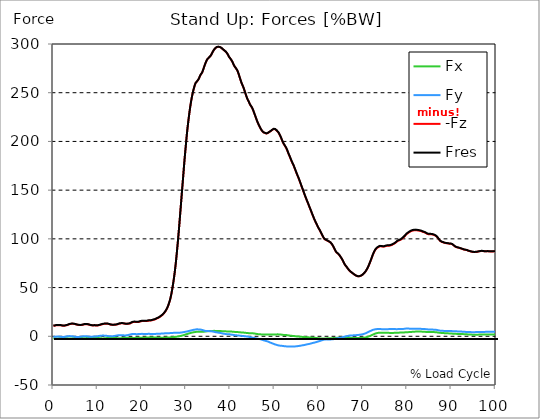
| Category |  Fx |  Fy |  -Fz |  Fres |
|---|---|---|---|---|
| 0.0 | -2.012 | -0.678 | 10.796 | 11.042 |
| 0.167348456675344 | -2.105 | -0.564 | 10.841 | 11.093 |
| 0.334696913350688 | -2.178 | -0.451 | 10.933 | 11.192 |
| 0.5020453700260321 | -2.222 | -0.402 | 11.114 | 11.377 |
| 0.669393826701376 | -2.264 | -0.354 | 11.294 | 11.561 |
| 0.83674228337672 | -2.264 | -0.311 | 11.34 | 11.601 |
| 1.0040907400520642 | -2.215 | -0.286 | 11.389 | 11.636 |
| 1.1621420602454444 | -2.163 | -0.285 | 11.427 | 11.659 |
| 1.3294905169207885 | -2.096 | -0.346 | 11.431 | 11.65 |
| 1.4968389735961325 | -1.988 | -0.458 | 11.356 | 11.561 |
| 1.6641874302714765 | -1.904 | -0.535 | 11.271 | 11.467 |
| 1.8315358869468206 | -1.839 | -0.616 | 11.125 | 11.324 |
| 1.9988843436221646 | -1.787 | -0.683 | 10.969 | 11.173 |
| 2.1662328002975086 | -1.768 | -0.686 | 10.851 | 11.054 |
| 2.333581256972853 | -1.779 | -0.636 | 10.795 | 10.994 |
| 2.5009297136481967 | -1.816 | -0.544 | 10.87 | 11.068 |
| 2.6682781703235405 | -1.85 | -0.436 | 11.017 | 11.212 |
| 2.8356266269988843 | -1.914 | -0.3 | 11.167 | 11.372 |
| 3.002975083674229 | -1.995 | -0.172 | 11.331 | 11.547 |
| 3.1703235403495724 | -2.083 | -0.059 | 11.519 | 11.742 |
| 3.337671997024917 | -2.187 | 0.063 | 11.827 | 12.063 |
| 3.4957233172182973 | -2.279 | 0.157 | 12.186 | 12.433 |
| 3.663071773893641 | -2.312 | 0.202 | 12.444 | 12.697 |
| 3.8304202305689854 | -2.305 | 0.189 | 12.641 | 12.89 |
| 3.997768687244329 | -2.253 | 0.122 | 12.739 | 12.979 |
| 4.165117143919673 | -2.19 | 0.047 | 12.81 | 13.038 |
| 4.332465600595017 | -2.113 | -0.046 | 12.842 | 13.058 |
| 4.499814057270361 | -2.01 | -0.167 | 12.809 | 13.014 |
| 4.667162513945706 | -1.898 | -0.305 | 12.736 | 12.93 |
| 4.834510970621049 | -1.778 | -0.455 | 12.582 | 12.768 |
| 5.001859427296393 | -1.671 | -0.591 | 12.383 | 12.566 |
| 5.169207883971737 | -1.606 | -0.669 | 12.154 | 12.337 |
| 5.336556340647081 | -1.542 | -0.727 | 11.914 | 12.097 |
| 5.503904797322425 | -1.518 | -0.734 | 11.768 | 11.95 |
| 5.671253253997769 | -1.523 | -0.707 | 11.649 | 11.83 |
| 5.82930457419115 | -1.561 | -0.637 | 11.558 | 11.739 |
| 5.996653030866494 | -1.611 | -0.548 | 11.492 | 11.673 |
| 6.164001487541838 | -1.677 | -0.434 | 11.493 | 11.678 |
| 6.331349944217181 | -1.74 | -0.326 | 11.55 | 11.743 |
| 6.498698400892526 | -1.827 | -0.19 | 11.669 | 11.873 |
| 6.66604685756787 | -1.909 | -0.076 | 11.864 | 12.081 |
| 6.833395314243213 | -1.954 | 0.013 | 12.068 | 12.303 |
| 7.000743770918558 | -1.993 | 0.096 | 12.266 | 12.517 |
| 7.168092227593902 | -1.99 | 0.12 | 12.366 | 12.615 |
| 7.335440684269246 | -1.933 | 0.082 | 12.416 | 12.654 |
| 7.50278914094459 | -1.823 | -0.015 | 12.43 | 12.652 |
| 7.6701375976199335 | -1.728 | -0.123 | 12.361 | 12.572 |
| 7.837486054295278 | -1.636 | -0.255 | 12.22 | 12.424 |
| 7.995537374488658 | -1.552 | -0.355 | 12.041 | 12.235 |
| 8.162885831164003 | -1.454 | -0.46 | 11.777 | 11.969 |
| 8.330234287839346 | -1.384 | -0.52 | 11.558 | 11.751 |
| 8.49758274451469 | -1.367 | -0.511 | 11.415 | 11.609 |
| 8.664931201190035 | -1.383 | -0.452 | 11.251 | 11.446 |
| 8.832279657865378 | -1.406 | -0.383 | 11.168 | 11.369 |
| 8.999628114540721 | -1.449 | -0.28 | 11.138 | 11.346 |
| 9.166976571216066 | -1.514 | -0.171 | 11.189 | 11.398 |
| 9.334325027891412 | -1.556 | -0.105 | 11.272 | 11.482 |
| 9.501673484566755 | -1.529 | -0.141 | 11.166 | 11.372 |
| 9.669021941242098 | -1.542 | -0.151 | 11.022 | 11.235 |
| 9.836370397917442 | -1.608 | -0.044 | 11.022 | 11.246 |
| 10.003718854592787 | -1.671 | 0.075 | 11.108 | 11.34 |
| 10.17106731126813 | -1.748 | 0.2 | 11.244 | 11.484 |
| 10.329118631461512 | -1.841 | 0.333 | 11.41 | 11.661 |
| 10.496467088136853 | -1.95 | 0.458 | 11.616 | 11.88 |
| 10.663815544812199 | -2.064 | 0.567 | 11.846 | 12.127 |
| 10.831164001487544 | -2.114 | 0.621 | 12.074 | 12.361 |
| 10.998512458162887 | -2.158 | 0.675 | 12.288 | 12.579 |
| 11.16586091483823 | -2.179 | 0.711 | 12.485 | 12.777 |
| 11.333209371513574 | -2.159 | 0.706 | 12.648 | 12.934 |
| 11.50055782818892 | -2.119 | 0.683 | 12.772 | 13.049 |
| 11.667906284864264 | -2.035 | 0.616 | 12.829 | 13.09 |
| 11.835254741539607 | -1.953 | 0.556 | 12.872 | 13.118 |
| 12.00260319821495 | -1.865 | 0.478 | 12.898 | 13.13 |
| 12.169951654890292 | -1.769 | 0.378 | 12.879 | 13.096 |
| 12.337300111565641 | -1.659 | 0.246 | 12.808 | 13.012 |
| 12.504648568240984 | -1.555 | 0.107 | 12.665 | 12.861 |
| 12.662699888434362 | -1.488 | 0.023 | 12.421 | 12.619 |
| 12.830048345109708 | -1.446 | -0.006 | 12.139 | 12.334 |
| 12.997396801785053 | -1.418 | -0.019 | 11.902 | 12.096 |
| 13.164745258460396 | -1.415 | 0.007 | 11.779 | 11.969 |
| 13.33209371513574 | -1.426 | 0.058 | 11.725 | 11.911 |
| 13.499442171811083 | -1.467 | 0.142 | 11.719 | 11.906 |
| 13.666790628486426 | -1.524 | 0.237 | 11.743 | 11.934 |
| 13.834139085161771 | -1.58 | 0.358 | 11.787 | 11.986 |
| 14.001487541837117 | -1.644 | 0.48 | 11.81 | 12.021 |
| 14.16883599851246 | -1.725 | 0.619 | 11.913 | 12.138 |
| 14.336184455187803 | -1.82 | 0.772 | 12.08 | 12.322 |
| 14.503532911863147 | -1.918 | 0.927 | 12.279 | 12.541 |
| 14.670881368538492 | -2.01 | 1.05 | 12.545 | 12.826 |
| 14.828932688731873 | -2.063 | 1.131 | 12.811 | 13.099 |
| 14.996281145407215 | -2.065 | 1.168 | 13.039 | 13.322 |
| 15.163629602082558 | -2.029 | 1.196 | 13.191 | 13.464 |
| 15.330978058757903 | -1.956 | 1.186 | 13.282 | 13.538 |
| 15.498326515433247 | -1.863 | 1.139 | 13.322 | 13.557 |
| 15.665674972108594 | -1.747 | 1.058 | 13.303 | 13.518 |
| 15.833023428783937 | -1.621 | 0.959 | 13.223 | 13.414 |
| 16.00037188545928 | -1.539 | 0.914 | 13.084 | 13.264 |
| 16.167720342134626 | -1.487 | 0.895 | 12.93 | 13.104 |
| 16.335068798809967 | -1.459 | 0.899 | 12.788 | 12.96 |
| 16.502417255485312 | -1.466 | 0.963 | 12.722 | 12.9 |
| 16.669765712160658 | -1.503 | 1.087 | 12.735 | 12.929 |
| 16.837114168836 | -1.556 | 1.245 | 12.782 | 12.998 |
| 17.004462625511344 | -1.62 | 1.423 | 12.869 | 13.111 |
| 17.16251394570472 | -1.69 | 1.616 | 12.986 | 13.258 |
| 17.32986240238007 | -1.771 | 1.804 | 13.154 | 13.458 |
| 17.497210859055414 | -1.849 | 1.998 | 13.465 | 13.803 |
| 17.664559315730756 | -1.886 | 2.195 | 13.993 | 14.354 |
| 17.8319077724061 | -1.879 | 2.298 | 14.312 | 14.679 |
| 17.999256229081443 | -1.85 | 2.355 | 14.561 | 14.927 |
| 18.166604685756788 | -1.809 | 2.362 | 14.697 | 15.058 |
| 18.333953142432133 | -1.749 | 2.332 | 14.762 | 15.116 |
| 18.501301599107478 | -1.662 | 2.254 | 14.764 | 15.104 |
| 18.668650055782823 | -1.606 | 2.212 | 14.655 | 14.988 |
| 18.835998512458165 | -1.556 | 2.179 | 14.535 | 14.863 |
| 19.00334696913351 | -1.533 | 2.194 | 14.533 | 14.857 |
| 19.170695425808855 | -1.547 | 2.249 | 14.643 | 14.967 |
| 19.338043882484197 | -1.576 | 2.314 | 14.759 | 15.089 |
| 19.496095202677576 | -1.566 | 2.364 | 14.978 | 15.315 |
| 19.66344365935292 | -1.579 | 2.461 | 15.227 | 15.586 |
| 19.830792116028263 | -1.559 | 2.517 | 15.429 | 15.799 |
| 19.998140572703612 | -1.486 | 2.476 | 15.582 | 15.945 |
| 20.165489029378953 | -1.452 | 2.452 | 15.604 | 15.962 |
| 20.3328374860543 | -1.456 | 2.469 | 15.594 | 15.954 |
| 20.500185942729644 | -1.478 | 2.512 | 15.676 | 16.037 |
| 20.667534399404985 | -1.406 | 2.453 | 15.679 | 16.032 |
| 20.83488285608033 | -1.355 | 2.401 | 15.644 | 15.99 |
| 21.002231312755672 | -1.329 | 2.376 | 15.615 | 15.958 |
| 21.16957976943102 | -1.306 | 2.407 | 15.692 | 16.045 |
| 21.336928226106362 | -1.297 | 2.469 | 15.825 | 16.191 |
| 21.504276682781704 | -1.315 | 2.522 | 16.027 | 16.403 |
| 21.67162513945705 | -1.296 | 2.506 | 16.166 | 16.535 |
| 21.82967645965043 | -1.274 | 2.443 | 16.157 | 16.511 |
| 21.997024916325774 | -1.253 | 2.379 | 16.148 | 16.485 |
| 22.16437337300112 | -1.263 | 2.392 | 16.234 | 16.566 |
| 22.33172182967646 | -1.286 | 2.437 | 16.52 | 16.858 |
| 22.499070286351806 | -1.273 | 2.451 | 16.771 | 17.105 |
| 22.666418743027148 | -1.27 | 2.443 | 16.958 | 17.289 |
| 22.833767199702496 | -1.266 | 2.434 | 17.144 | 17.471 |
| 23.00111565637784 | -1.285 | 2.414 | 17.356 | 17.674 |
| 23.168464113053183 | -1.323 | 2.443 | 17.686 | 18.004 |
| 23.335812569728528 | -1.403 | 2.53 | 18.183 | 18.511 |
| 23.50316102640387 | -1.452 | 2.565 | 18.614 | 18.942 |
| 23.670509483079215 | -1.417 | 2.498 | 18.804 | 19.116 |
| 23.83785793975456 | -1.444 | 2.542 | 19.213 | 19.525 |
| 23.995909259947936 | -1.479 | 2.604 | 19.658 | 19.975 |
| 24.163257716623285 | -1.511 | 2.669 | 20.135 | 20.453 |
| 24.330606173298627 | -1.514 | 2.74 | 20.806 | 21.127 |
| 24.49795462997397 | -1.501 | 2.777 | 21.369 | 21.688 |
| 24.665303086649313 | -1.487 | 2.814 | 21.932 | 22.248 |
| 24.83265154332466 | -1.482 | 2.9 | 22.739 | 23.05 |
| 25.0 | -1.459 | 2.962 | 23.581 | 23.884 |
| 25.167348456675345 | -1.426 | 3.008 | 24.434 | 24.729 |
| 25.334696913350694 | -1.389 | 3.041 | 25.596 | 25.88 |
| 25.502045370026035 | -1.352 | 3.074 | 26.87 | 27.144 |
| 25.669393826701377 | -1.322 | 3.121 | 28.261 | 28.524 |
| 25.836742283376722 | -1.276 | 3.137 | 29.911 | 30.161 |
| 26.004090740052067 | -1.225 | 3.145 | 31.82 | 32.056 |
| 26.17143919672741 | -1.187 | 3.171 | 34.094 | 34.316 |
| 26.329490516920792 | -1.15 | 3.241 | 36.573 | 36.783 |
| 26.49683897359613 | -1.135 | 3.323 | 39.505 | 39.706 |
| 26.66418743027148 | -1.096 | 3.399 | 43.011 | 43.2 |
| 26.831535886946828 | -1.01 | 3.459 | 47.035 | 47.21 |
| 26.998884343622166 | -0.899 | 3.483 | 51.619 | 51.779 |
| 27.166232800297514 | -0.827 | 3.503 | 56.539 | 56.687 |
| 27.333581256972852 | -0.783 | 3.534 | 61.817 | 61.954 |
| 27.5009297136482 | -0.7 | 3.556 | 67.81 | 67.936 |
| 27.668278170323543 | -0.563 | 3.567 | 74.366 | 74.481 |
| 27.835626626998888 | -0.426 | 3.572 | 81.74 | 81.843 |
| 28.002975083674233 | -0.312 | 3.585 | 89.724 | 89.817 |
| 28.170323540349575 | -0.221 | 3.625 | 97.872 | 97.956 |
| 28.33767199702492 | -0.106 | 3.675 | 106.579 | 106.657 |
| 28.50502045370026 | 0.05 | 3.73 | 115.634 | 115.707 |
| 28.663071773893645 | 0.225 | 3.738 | 125.172 | 125.24 |
| 28.830420230568986 | 0.425 | 3.776 | 134.607 | 134.671 |
| 28.99776868724433 | 0.614 | 3.864 | 144.114 | 144.177 |
| 29.165117143919673 | 0.794 | 3.983 | 153.514 | 153.579 |
| 29.33246560059502 | 0.997 | 4.159 | 162.799 | 162.866 |
| 29.499814057270367 | 1.245 | 4.311 | 172.449 | 172.519 |
| 29.66716251394571 | 1.488 | 4.451 | 181.618 | 181.691 |
| 29.834510970621054 | 1.718 | 4.567 | 189.998 | 190.073 |
| 30.00185942729639 | 1.979 | 4.739 | 198.314 | 198.395 |
| 30.169207883971744 | 2.241 | 4.899 | 206.441 | 206.527 |
| 30.33655634064708 | 2.488 | 5.063 | 213.61 | 213.703 |
| 30.50390479732243 | 2.737 | 5.259 | 220.084 | 220.184 |
| 30.671253253997772 | 2.955 | 5.431 | 226.178 | 226.283 |
| 30.829304574191156 | 3.156 | 5.611 | 231.869 | 231.981 |
| 30.996653030866494 | 3.357 | 5.835 | 237.072 | 237.19 |
| 31.164001487541842 | 3.568 | 6.067 | 241.7 | 241.825 |
| 31.331349944217187 | 3.762 | 6.253 | 245.808 | 245.939 |
| 31.498698400892525 | 3.92 | 6.414 | 249.475 | 249.61 |
| 31.666046857567874 | 4.059 | 6.577 | 252.616 | 252.756 |
| 31.833395314243212 | 4.196 | 6.732 | 255.439 | 255.585 |
| 32.00074377091856 | 4.342 | 6.858 | 257.969 | 258.119 |
| 32.1680922275939 | 4.463 | 7.017 | 259.952 | 260.108 |
| 32.33544068426925 | 4.541 | 7.092 | 260.845 | 261.003 |
| 32.50278914094459 | 4.607 | 7.125 | 261.676 | 261.837 |
| 32.670137597619934 | 4.658 | 7.113 | 262.476 | 262.636 |
| 32.83748605429528 | 4.689 | 7.055 | 263.826 | 263.983 |
| 33.004834510970625 | 4.709 | 6.983 | 265.425 | 265.579 |
| 33.162885831164004 | 4.718 | 6.895 | 267.306 | 267.456 |
| 33.33023428783935 | 4.734 | 6.809 | 268.622 | 268.77 |
| 33.497582744514695 | 4.725 | 6.674 | 269.728 | 269.87 |
| 33.664931201190036 | 4.711 | 6.513 | 270.961 | 271.098 |
| 33.83227965786538 | 4.735 | 6.291 | 273.015 | 273.145 |
| 33.99962811454073 | 4.735 | 5.966 | 275.261 | 275.384 |
| 34.16697657121607 | 4.775 | 5.615 | 277.505 | 277.623 |
| 34.33432502789141 | 4.845 | 5.508 | 279.517 | 279.634 |
| 34.50167348456676 | 4.975 | 5.454 | 281.409 | 281.528 |
| 34.6690219412421 | 5.062 | 5.315 | 283.151 | 283.269 |
| 34.83637039791744 | 5.189 | 5.315 | 284.423 | 284.542 |
| 35.00371885459279 | 5.255 | 5.334 | 285.145 | 285.268 |
| 35.17106731126814 | 5.328 | 5.291 | 285.995 | 286.118 |
| 35.338415767943474 | 5.36 | 5.257 | 286.798 | 286.921 |
| 35.49646708813686 | 5.379 | 5.23 | 287.575 | 287.7 |
| 35.6638155448122 | 5.402 | 5.169 | 288.646 | 288.769 |
| 35.831164001487544 | 5.432 | 5.07 | 290.081 | 290.202 |
| 35.998512458162885 | 5.483 | 4.932 | 291.584 | 291.703 |
| 36.165860914838234 | 5.54 | 4.788 | 292.918 | 293.036 |
| 36.333209371513576 | 5.576 | 4.621 | 294.132 | 294.247 |
| 36.50055782818892 | 5.575 | 4.411 | 295.123 | 295.236 |
| 36.667906284864266 | 5.513 | 4.222 | 295.896 | 296.005 |
| 36.83525474153961 | 5.441 | 4.059 | 296.416 | 296.521 |
| 37.002603198214956 | 5.368 | 3.968 | 296.917 | 297.019 |
| 37.1699516548903 | 5.335 | 3.872 | 297.098 | 297.199 |
| 37.337300111565646 | 5.309 | 3.739 | 297.111 | 297.21 |
| 37.50464856824098 | 5.316 | 3.625 | 297.034 | 297.133 |
| 37.66269988843437 | 5.318 | 3.494 | 296.807 | 296.904 |
| 37.83004834510971 | 5.312 | 3.328 | 296.45 | 296.548 |
| 37.99739680178505 | 5.295 | 3.162 | 295.981 | 296.079 |
| 38.16474525846039 | 5.251 | 2.998 | 295.335 | 295.431 |
| 38.33209371513574 | 5.165 | 2.822 | 294.567 | 294.659 |
| 38.49944217181109 | 5.114 | 2.671 | 293.927 | 294.018 |
| 38.666790628486424 | 5.104 | 2.547 | 293.317 | 293.408 |
| 38.83413908516178 | 5.086 | 2.416 | 292.695 | 292.786 |
| 39.001487541837115 | 5.057 | 2.281 | 292.061 | 292.15 |
| 39.16883599851246 | 5.028 | 2.191 | 291.089 | 291.177 |
| 39.336184455187805 | 4.993 | 2.143 | 290.025 | 290.115 |
| 39.503532911863154 | 4.97 | 2.105 | 288.757 | 288.845 |
| 39.670881368538495 | 4.914 | 2.126 | 287.169 | 287.257 |
| 39.83822982521384 | 4.886 | 2.01 | 286.11 | 286.199 |
| 39.996281145407224 | 4.869 | 1.882 | 285.085 | 285.173 |
| 40.163629602082565 | 4.847 | 1.748 | 284.04 | 284.128 |
| 40.33097805875791 | 4.8 | 1.643 | 282.827 | 282.915 |
| 40.498326515433256 | 4.749 | 1.538 | 281.532 | 281.621 |
| 40.6656749721086 | 4.667 | 1.426 | 279.694 | 279.783 |
| 40.83302342878393 | 4.581 | 1.304 | 278.102 | 278.191 |
| 41.00037188545929 | 4.506 | 1.195 | 276.827 | 276.916 |
| 41.16772034213463 | 4.439 | 1.107 | 275.768 | 275.857 |
| 41.33506879880997 | 4.393 | 1.019 | 274.675 | 274.766 |
| 41.50241725548531 | 4.359 | 0.93 | 273.564 | 273.656 |
| 41.66976571216066 | 4.317 | 0.862 | 272.073 | 272.166 |
| 41.837114168836 | 4.269 | 0.808 | 269.959 | 270.052 |
| 42.004462625511344 | 4.207 | 0.726 | 267.659 | 267.752 |
| 42.17181108218669 | 4.115 | 0.638 | 265.224 | 265.317 |
| 42.32986240238007 | 4.014 | 0.533 | 262.867 | 262.96 |
| 42.497210859055414 | 3.919 | 0.465 | 260.574 | 260.666 |
| 42.66455931573076 | 3.882 | 0.389 | 258.69 | 258.782 |
| 42.831907772406105 | 3.844 | 0.318 | 256.949 | 257.042 |
| 42.999256229081446 | 3.801 | 0.242 | 255.127 | 255.221 |
| 43.16660468575679 | 3.683 | 0.12 | 252.88 | 252.975 |
| 43.33395314243214 | 3.591 | 0.018 | 250.533 | 250.626 |
| 43.50130159910748 | 3.525 | -0.05 | 248.241 | 248.335 |
| 43.66865005578282 | 3.449 | -0.121 | 246.058 | 246.152 |
| 43.83599851245817 | 3.338 | -0.212 | 243.987 | 244.082 |
| 44.00334696913351 | 3.269 | -0.35 | 242.333 | 242.429 |
| 44.17069542580886 | 3.235 | -0.521 | 240.987 | 241.085 |
| 44.3380438824842 | 3.169 | -0.684 | 239.144 | 239.245 |
| 44.49609520267758 | 3.14 | -0.867 | 237.555 | 237.658 |
| 44.66344365935292 | 3.145 | -1.044 | 236.434 | 236.542 |
| 44.83079211602827 | 3.119 | -1.239 | 235.339 | 235.453 |
| 44.99814057270361 | 3.091 | -1.396 | 233.868 | 233.987 |
| 45.16548902937895 | 3.05 | -1.534 | 232.146 | 232.268 |
| 45.332837486054295 | 2.926 | -1.688 | 230.008 | 230.131 |
| 45.500185942729644 | 2.81 | -1.81 | 227.964 | 228.088 |
| 45.66753439940499 | 2.688 | -1.951 | 225.924 | 226.05 |
| 45.83488285608033 | 2.523 | -2.104 | 223.795 | 223.925 |
| 46.00223131275568 | 2.369 | -2.261 | 221.651 | 221.782 |
| 46.16957976943102 | 2.258 | -2.427 | 219.748 | 219.885 |
| 46.336928226106366 | 2.169 | -2.569 | 218.055 | 218.195 |
| 46.50427668278171 | 2.105 | -2.719 | 216.359 | 216.502 |
| 46.671625139457056 | 2.048 | -2.895 | 214.822 | 214.968 |
| 46.829676459650436 | 1.993 | -3.064 | 213.403 | 213.552 |
| 46.99702491632577 | 1.934 | -3.237 | 212.086 | 212.236 |
| 47.16437337300112 | 1.863 | -3.489 | 210.947 | 211.097 |
| 47.33172182967646 | 1.803 | -3.755 | 209.931 | 210.082 |
| 47.49907028635181 | 1.793 | -4.012 | 209.282 | 209.432 |
| 47.66641874302716 | 1.817 | -4.256 | 208.948 | 209.097 |
| 47.83376719970249 | 1.837 | -4.502 | 208.711 | 208.863 |
| 48.001115656377834 | 1.846 | -4.679 | 208.373 | 208.527 |
| 48.16846411305319 | 1.851 | -4.872 | 208.121 | 208.279 |
| 48.33581256972853 | 1.866 | -5.12 | 208.287 | 208.446 |
| 48.50316102640387 | 1.884 | -5.364 | 208.634 | 208.792 |
| 48.67050948307921 | 1.898 | -5.679 | 209.029 | 209.186 |
| 48.837857939754564 | 1.822 | -6.029 | 209.726 | 209.89 |
| 49.005206396429905 | 1.743 | -6.381 | 210.443 | 210.616 |
| 49.163257716623285 | 1.742 | -6.671 | 210.669 | 210.847 |
| 49.33060617329863 | 1.78 | -6.938 | 211.196 | 211.382 |
| 49.49795462997397 | 1.815 | -7.22 | 211.887 | 212.083 |
| 49.66530308664932 | 1.816 | -7.516 | 212.521 | 212.725 |
| 49.832651543324666 | 1.791 | -7.856 | 212.771 | 212.984 |
| 50.0 | 1.787 | -8.193 | 212.717 | 212.941 |
| 50.16734845667534 | 1.84 | -8.429 | 212.47 | 212.704 |
| 50.33469691335069 | 1.855 | -8.622 | 211.787 | 212.027 |
| 50.50204537002604 | 1.928 | -8.834 | 211.191 | 211.438 |
| 50.66939382670139 | 2.001 | -9.064 | 210.43 | 210.683 |
| 50.836742283376715 | 1.969 | -9.243 | 209.452 | 209.713 |
| 51.00409074005207 | 1.926 | -9.449 | 208.294 | 208.565 |
| 51.17143919672741 | 1.881 | -9.606 | 206.828 | 207.105 |
| 51.32949051692079 | 1.829 | -9.704 | 205.263 | 205.544 |
| 51.496838973596134 | 1.758 | -9.749 | 203.504 | 203.786 |
| 51.66418743027148 | 1.646 | -9.785 | 201.567 | 201.85 |
| 51.831535886946824 | 1.495 | -9.858 | 199.69 | 199.981 |
| 51.99888434362217 | 1.427 | -10.007 | 198.094 | 198.393 |
| 52.16623280029752 | 1.4 | -10.154 | 196.797 | 197.104 |
| 52.33358125697285 | 1.375 | -10.24 | 195.586 | 195.898 |
| 52.5009297136482 | 1.341 | -10.287 | 194.384 | 194.7 |
| 52.668278170323546 | 1.279 | -10.357 | 193.033 | 193.351 |
| 52.835626626998895 | 1.162 | -10.437 | 191.354 | 191.674 |
| 53.00297508367424 | 1.02 | -10.51 | 189.337 | 189.661 |
| 53.17032354034958 | 0.895 | -10.58 | 187.345 | 187.675 |
| 53.33767199702492 | 0.785 | -10.617 | 185.542 | 185.876 |
| 53.50502045370027 | 0.711 | -10.58 | 183.817 | 184.15 |
| 53.663071773893655 | 0.618 | -10.577 | 181.908 | 182.242 |
| 53.83042023056899 | 0.531 | -10.585 | 180.013 | 180.349 |
| 53.99776868724433 | 0.433 | -10.549 | 178.313 | 178.65 |
| 54.16511714391967 | 0.361 | -10.499 | 176.72 | 177.055 |
| 54.33246560059503 | 0.277 | -10.497 | 175.092 | 175.428 |
| 54.49981405727037 | 0.182 | -10.434 | 173.106 | 173.439 |
| 54.667162513945705 | 0.089 | -10.403 | 171.162 | 171.498 |
| 54.834510970621054 | -0.02 | -10.331 | 169.171 | 169.506 |
| 55.0018594272964 | -0.119 | -10.222 | 167.184 | 167.515 |
| 55.169207883971744 | -0.187 | -10.113 | 165.262 | 165.589 |
| 55.336556340647086 | -0.248 | -10.037 | 163.522 | 163.848 |
| 55.50390479732243 | -0.32 | -9.93 | 161.627 | 161.949 |
| 55.671253253997776 | -0.399 | -9.806 | 159.592 | 159.91 |
| 55.83860171067312 | -0.467 | -9.692 | 157.496 | 157.81 |
| 55.9966530308665 | -0.516 | -9.572 | 155.4 | 155.711 |
| 56.16400148754184 | -0.575 | -9.427 | 153.299 | 153.605 |
| 56.33134994421718 | -0.625 | -9.263 | 151.279 | 151.579 |
| 56.498698400892536 | -0.679 | -9.134 | 149.186 | 149.481 |
| 56.66604685756788 | -0.755 | -8.999 | 147.077 | 147.369 |
| 56.83339531424321 | -0.835 | -8.833 | 145.02 | 145.307 |
| 57.00074377091856 | -0.89 | -8.679 | 143.024 | 143.306 |
| 57.16809222759391 | -0.917 | -8.499 | 141.068 | 141.343 |
| 57.33544068426925 | -0.987 | -8.309 | 139.14 | 139.408 |
| 57.5027891409446 | -1.037 | -8.185 | 137.383 | 137.648 |
| 57.670137597619934 | -1.088 | -8.013 | 135.446 | 135.705 |
| 57.83748605429528 | -1.133 | -7.901 | 133.45 | 133.707 |
| 58.004834510970625 | -1.187 | -7.713 | 131.51 | 131.761 |
| 58.16288583116401 | -1.263 | -7.485 | 129.597 | 129.84 |
| 58.330234287839346 | -1.32 | -7.263 | 127.714 | 127.95 |
| 58.497582744514695 | -1.38 | -7.05 | 125.77 | 125.998 |
| 58.66493120119004 | -1.423 | -6.845 | 123.835 | 124.057 |
| 58.832279657865385 | -1.442 | -6.671 | 121.938 | 122.156 |
| 58.999628114540734 | -1.49 | -6.515 | 120.117 | 120.331 |
| 59.16697657121607 | -1.569 | -6.314 | 118.413 | 118.623 |
| 59.33432502789142 | -1.669 | -6.092 | 116.808 | 117.013 |
| 59.50167348456676 | -1.797 | -5.898 | 115.229 | 115.43 |
| 59.66902194124211 | -1.877 | -5.659 | 113.633 | 113.828 |
| 59.83637039791745 | -1.96 | -5.385 | 112.044 | 112.232 |
| 60.00371885459278 | -2.053 | -5.13 | 110.653 | 110.834 |
| 60.17106731126813 | -2.154 | -4.893 | 109.452 | 109.626 |
| 60.33841576794349 | -2.167 | -4.695 | 107.968 | 108.135 |
| 60.49646708813685 | -2.173 | -4.459 | 106.472 | 106.636 |
| 60.6638155448122 | -2.173 | -4.208 | 104.981 | 105.143 |
| 60.831164001487544 | -2.162 | -3.941 | 103.408 | 103.568 |
| 60.99851245816289 | -2.156 | -3.679 | 101.959 | 102.119 |
| 61.16586091483824 | -2.139 | -3.478 | 100.692 | 100.854 |
| 61.333209371513576 | -2.146 | -3.317 | 99.648 | 99.811 |
| 61.50055782818892 | -2.184 | -3.168 | 98.995 | 99.157 |
| 61.667906284864266 | -2.175 | -3.162 | 98.812 | 98.976 |
| 61.835254741539615 | -2.122 | -3.213 | 98.582 | 98.747 |
| 62.002603198214956 | -2.051 | -3.283 | 98.054 | 98.225 |
| 62.16995165489029 | -2.034 | -3.295 | 97.583 | 97.755 |
| 62.33730011156564 | -2.049 | -3.272 | 97.205 | 97.377 |
| 62.504648568240995 | -2.063 | -3.249 | 96.817 | 96.99 |
| 62.67199702491633 | -2.034 | -3.245 | 96.235 | 96.41 |
| 62.83004834510971 | -1.989 | -3.158 | 95.374 | 95.552 |
| 62.99739680178505 | -1.942 | -3.094 | 94.367 | 94.548 |
| 63.1647452584604 | -1.889 | -3.022 | 93.133 | 93.313 |
| 63.33209371513575 | -1.839 | -2.954 | 91.76 | 91.941 |
| 63.4994421718111 | -1.771 | -2.83 | 90.274 | 90.453 |
| 63.666790628486424 | -1.699 | -2.638 | 88.655 | 88.831 |
| 63.83413908516177 | -1.652 | -2.435 | 87.264 | 87.438 |
| 64.00148754183712 | -1.625 | -2.228 | 86.133 | 86.305 |
| 64.16883599851248 | -1.617 | -2.072 | 85.316 | 85.485 |
| 64.3361844551878 | -1.618 | -1.918 | 84.909 | 85.076 |
| 64.50353291186315 | -1.605 | -1.777 | 84.324 | 84.488 |
| 64.6708813685385 | -1.574 | -1.651 | 83.296 | 83.46 |
| 64.83822982521384 | -1.53 | -1.52 | 82.189 | 82.354 |
| 65.00557828188919 | -1.486 | -1.379 | 81.102 | 81.264 |
| 65.16362960208257 | -1.467 | -1.189 | 79.903 | 80.064 |
| 65.3309780587579 | -1.445 | -1.013 | 78.617 | 78.772 |
| 65.49832651543326 | -1.418 | -0.818 | 77.183 | 77.333 |
| 65.6656749721086 | -1.425 | -0.58 | 75.568 | 75.712 |
| 65.83302342878395 | -1.429 | -0.345 | 74.084 | 74.222 |
| 66.00037188545929 | -1.435 | -0.134 | 72.881 | 73.016 |
| 66.16772034213463 | -1.459 | 0.022 | 71.89 | 72.021 |
| 66.33506879880998 | -1.482 | 0.126 | 71.017 | 71.148 |
| 66.50241725548531 | -1.498 | 0.287 | 69.941 | 70.068 |
| 66.66976571216065 | -1.537 | 0.464 | 68.929 | 69.055 |
| 66.83711416883601 | -1.559 | 0.616 | 67.963 | 68.087 |
| 67.00446262551135 | -1.582 | 0.763 | 67.096 | 67.217 |
| 67.1718110821867 | -1.618 | 0.852 | 66.411 | 66.527 |
| 67.32986240238007 | -1.649 | 0.845 | 65.82 | 65.929 |
| 67.49721085905541 | -1.692 | 0.837 | 65.292 | 65.396 |
| 67.66455931573076 | -1.713 | 0.925 | 64.755 | 64.855 |
| 67.83190777240611 | -1.715 | 0.983 | 64.122 | 64.218 |
| 67.99925622908145 | -1.725 | 0.951 | 63.518 | 63.609 |
| 68.16660468575678 | -1.732 | 1.034 | 63.007 | 63.096 |
| 68.33395314243214 | -1.71 | 1.119 | 62.447 | 62.533 |
| 68.50130159910749 | -1.739 | 1.201 | 62.143 | 62.228 |
| 68.66865005578282 | -1.745 | 1.258 | 61.879 | 61.962 |
| 68.83599851245816 | -1.703 | 1.318 | 61.658 | 61.739 |
| 69.00334696913352 | -1.718 | 1.418 | 61.659 | 61.741 |
| 69.17069542580886 | -1.71 | 1.52 | 61.662 | 61.744 |
| 69.3380438824842 | -1.704 | 1.613 | 61.768 | 61.849 |
| 69.50539233915956 | -1.684 | 1.72 | 62.071 | 62.156 |
| 69.66344365935292 | -1.653 | 1.852 | 62.451 | 62.537 |
| 69.83079211602826 | -1.613 | 2.001 | 62.963 | 63.051 |
| 69.99814057270362 | -1.554 | 2.169 | 63.569 | 63.659 |
| 70.16548902937896 | -1.495 | 2.376 | 64.314 | 64.409 |
| 70.33283748605429 | -1.395 | 2.619 | 65.103 | 65.204 |
| 70.50018594272964 | -1.252 | 2.89 | 66.016 | 66.123 |
| 70.667534399405 | -1.103 | 3.209 | 67.088 | 67.206 |
| 70.83488285608033 | -0.93 | 3.551 | 68.293 | 68.425 |
| 71.00223131275568 | -0.717 | 3.902 | 69.633 | 69.78 |
| 71.16957976943102 | -0.463 | 4.273 | 71.173 | 71.339 |
| 71.33692822610637 | -0.189 | 4.661 | 72.874 | 73.063 |
| 71.50427668278171 | 0.104 | 5.044 | 74.697 | 74.912 |
| 71.67162513945706 | 0.445 | 5.41 | 76.627 | 76.866 |
| 71.8389735961324 | 0.829 | 5.786 | 78.614 | 78.883 |
| 71.99702491632577 | 1.173 | 6.111 | 80.61 | 80.908 |
| 72.16437337300113 | 1.546 | 6.465 | 82.78 | 83.107 |
| 72.33172182967647 | 1.903 | 6.72 | 84.618 | 84.968 |
| 72.49907028635181 | 2.244 | 6.919 | 86.299 | 86.669 |
| 72.66641874302715 | 2.566 | 7.074 | 87.753 | 88.138 |
| 72.8337671997025 | 2.861 | 7.204 | 88.988 | 89.387 |
| 73.00111565637783 | 3.096 | 7.305 | 89.928 | 90.341 |
| 73.16846411305319 | 3.283 | 7.397 | 90.676 | 91.1 |
| 73.33581256972853 | 3.429 | 7.475 | 91.196 | 91.631 |
| 73.50316102640387 | 3.55 | 7.502 | 91.642 | 92.084 |
| 73.67050948307921 | 3.665 | 7.516 | 92.068 | 92.515 |
| 73.83785793975457 | 3.644 | 7.464 | 92.368 | 92.816 |
| 74.00520639642991 | 3.641 | 7.402 | 92.461 | 92.912 |
| 74.16325771662328 | 3.671 | 7.331 | 92.283 | 92.737 |
| 74.33060617329863 | 3.692 | 7.263 | 92.123 | 92.582 |
| 74.49795462997398 | 3.696 | 7.202 | 92.006 | 92.47 |
| 74.66530308664932 | 3.685 | 7.153 | 91.992 | 92.46 |
| 74.83265154332466 | 3.658 | 7.117 | 92.072 | 92.542 |
| 75.00000000000001 | 3.646 | 7.117 | 92.281 | 92.755 |
| 75.16734845667534 | 3.654 | 7.172 | 92.654 | 93.132 |
| 75.3346969133507 | 3.637 | 7.221 | 92.916 | 93.397 |
| 75.50204537002605 | 3.591 | 7.269 | 92.933 | 93.411 |
| 75.66939382670138 | 3.541 | 7.315 | 92.917 | 93.391 |
| 75.83674228337672 | 3.512 | 7.367 | 92.95 | 93.42 |
| 76.00409074005208 | 3.487 | 7.42 | 92.999 | 93.466 |
| 76.17143919672742 | 3.469 | 7.467 | 93.175 | 93.639 |
| 76.33878765340276 | 3.453 | 7.512 | 93.386 | 93.846 |
| 76.49683897359614 | 3.445 | 7.514 | 93.711 | 94.167 |
| 76.66418743027148 | 3.439 | 7.495 | 94.093 | 94.545 |
| 76.83153588694682 | 3.462 | 7.466 | 94.49 | 94.941 |
| 76.99888434362218 | 3.504 | 7.431 | 94.9 | 95.351 |
| 77.16623280029752 | 3.5 | 7.451 | 95.326 | 95.782 |
| 77.33358125697285 | 3.498 | 7.369 | 95.897 | 96.351 |
| 77.5009297136482 | 3.506 | 7.272 | 96.479 | 96.93 |
| 77.66827817032356 | 3.559 | 7.278 | 97.108 | 97.562 |
| 77.83562662699889 | 3.606 | 7.338 | 97.791 | 98.246 |
| 78.00297508367423 | 3.641 | 7.423 | 98.214 | 98.675 |
| 78.17032354034959 | 3.746 | 7.394 | 98.426 | 98.89 |
| 78.33767199702493 | 3.795 | 7.406 | 98.643 | 99.111 |
| 78.50502045370027 | 3.804 | 7.456 | 99.052 | 99.525 |
| 78.67236891037561 | 3.826 | 7.501 | 99.6 | 100.079 |
| 78.83042023056899 | 3.893 | 7.537 | 100.206 | 100.691 |
| 78.99776868724433 | 3.959 | 7.55 | 100.89 | 101.381 |
| 79.16511714391969 | 3.967 | 7.6 | 101.493 | 101.988 |
| 79.33246560059503 | 3.981 | 7.638 | 102.217 | 102.72 |
| 79.49981405727036 | 3.995 | 7.731 | 103.021 | 103.535 |
| 79.66716251394571 | 4.094 | 7.906 | 103.951 | 104.483 |
| 79.83451097062107 | 4.141 | 7.955 | 104.773 | 105.311 |
| 80.00185942729641 | 4.182 | 7.964 | 105.331 | 105.872 |
| 80.16920788397174 | 4.239 | 7.954 | 105.918 | 106.462 |
| 80.33655634064709 | 4.273 | 7.877 | 106.397 | 106.942 |
| 80.50390479732243 | 4.32 | 7.826 | 106.997 | 107.544 |
| 80.67125325399778 | 4.394 | 7.825 | 107.537 | 108.084 |
| 80.83860171067312 | 4.435 | 7.789 | 107.806 | 108.351 |
| 80.99665303086651 | 4.498 | 7.745 | 108.11 | 108.655 |
| 81.16400148754184 | 4.565 | 7.786 | 108.453 | 109.004 |
| 81.3313499442172 | 4.622 | 7.795 | 108.546 | 109.097 |
| 81.49869840089255 | 4.669 | 7.81 | 108.729 | 109.285 |
| 81.66604685756786 | 4.713 | 7.83 | 108.867 | 109.425 |
| 81.83339531424322 | 4.778 | 7.825 | 108.921 | 109.48 |
| 82.00074377091858 | 4.858 | 7.801 | 108.874 | 109.431 |
| 82.16809222759392 | 4.913 | 7.766 | 108.782 | 109.339 |
| 82.33544068426926 | 4.902 | 7.753 | 108.692 | 109.245 |
| 82.50278914094459 | 4.9 | 7.741 | 108.557 | 109.108 |
| 82.67013759761994 | 4.902 | 7.732 | 108.392 | 108.941 |
| 82.83748605429528 | 4.909 | 7.713 | 108.26 | 108.804 |
| 83.00483451097062 | 4.854 | 7.659 | 108.113 | 108.646 |
| 83.17218296764597 | 4.794 | 7.622 | 107.937 | 108.462 |
| 83.33023428783935 | 4.77 | 7.561 | 107.631 | 108.148 |
| 83.4975827445147 | 4.753 | 7.48 | 107.273 | 107.781 |
| 83.66493120119004 | 4.736 | 7.459 | 107.034 | 107.535 |
| 83.83227965786537 | 4.654 | 7.451 | 106.799 | 107.292 |
| 83.99962811454073 | 4.566 | 7.413 | 106.496 | 106.978 |
| 84.16697657121607 | 4.502 | 7.338 | 106.097 | 106.567 |
| 84.33432502789142 | 4.48 | 7.252 | 105.627 | 106.09 |
| 84.50167348456677 | 4.462 | 7.137 | 105.184 | 105.637 |
| 84.6690219412421 | 4.442 | 7.071 | 104.929 | 105.376 |
| 84.83637039791745 | 4.423 | 7.017 | 104.737 | 105.178 |
| 85.0037188545928 | 4.407 | 6.998 | 104.744 | 105.179 |
| 85.17106731126813 | 4.391 | 6.979 | 104.751 | 105.18 |
| 85.33841576794349 | 4.375 | 6.959 | 104.754 | 105.178 |
| 85.50576422461883 | 4.381 | 6.931 | 104.661 | 105.08 |
| 85.66381554481221 | 4.386 | 6.902 | 104.569 | 104.982 |
| 85.83116400148755 | 4.333 | 6.847 | 104.351 | 104.756 |
| 85.99851245816289 | 4.279 | 6.792 | 104.135 | 104.53 |
| 86.16586091483823 | 4.268 | 6.766 | 103.817 | 104.208 |
| 86.33320937151358 | 4.257 | 6.742 | 103.499 | 103.884 |
| 86.50055782818893 | 4.178 | 6.657 | 103.007 | 103.381 |
| 86.66790628486427 | 4.083 | 6.558 | 102.338 | 102.701 |
| 86.83525474153961 | 3.979 | 6.421 | 101.584 | 101.932 |
| 87.00260319821496 | 3.843 | 6.209 | 100.545 | 100.873 |
| 87.16995165489031 | 3.691 | 5.99 | 99.454 | 99.761 |
| 87.33730011156564 | 3.601 | 5.859 | 98.499 | 98.793 |
| 87.504648568241 | 3.516 | 5.741 | 97.726 | 98.008 |
| 87.67199702491634 | 3.462 | 5.66 | 97.192 | 97.467 |
| 87.83004834510972 | 3.419 | 5.624 | 96.843 | 97.113 |
| 87.99739680178506 | 3.384 | 5.613 | 96.59 | 96.858 |
| 88.1647452584604 | 3.325 | 5.57 | 96.37 | 96.633 |
| 88.33209371513574 | 3.247 | 5.523 | 96.055 | 96.311 |
| 88.49944217181108 | 3.19 | 5.507 | 95.804 | 96.056 |
| 88.66679062848644 | 3.158 | 5.506 | 95.645 | 95.897 |
| 88.83413908516178 | 3.122 | 5.516 | 95.538 | 95.788 |
| 89.00148754183712 | 3.085 | 5.525 | 95.479 | 95.727 |
| 89.16883599851246 | 3.027 | 5.467 | 95.341 | 95.584 |
| 89.33618445518782 | 2.986 | 5.443 | 95.282 | 95.522 |
| 89.50353291186315 | 2.91 | 5.411 | 95.068 | 95.304 |
| 89.6708813685385 | 2.887 | 5.403 | 95.018 | 95.251 |
| 89.83822982521386 | 2.864 | 5.389 | 94.975 | 95.206 |
| 90.00557828188919 | 2.825 | 5.356 | 94.855 | 95.082 |
| 90.16362960208257 | 2.748 | 5.293 | 94.563 | 94.786 |
| 90.3309780587579 | 2.665 | 5.221 | 94.019 | 94.235 |
| 90.49832651543326 | 2.591 | 5.159 | 93.387 | 93.598 |
| 90.66567497210859 | 2.58 | 5.15 | 92.608 | 92.82 |
| 90.83302342878395 | 2.553 | 5.141 | 92.142 | 92.351 |
| 91.00037188545929 | 2.5 | 5.104 | 91.78 | 91.987 |
| 91.16772034213463 | 2.476 | 5.071 | 91.412 | 91.617 |
| 91.33506879880998 | 2.438 | 5.031 | 91.2 | 91.4 |
| 91.50241725548533 | 2.438 | 5.008 | 91.001 | 91.199 |
| 91.66976571216065 | 2.465 | 4.994 | 90.84 | 91.035 |
| 91.83711416883601 | 2.437 | 4.951 | 90.619 | 90.812 |
| 92.00446262551137 | 2.404 | 4.896 | 90.275 | 90.464 |
| 92.1718110821867 | 2.363 | 4.845 | 90.067 | 90.251 |
| 92.33915953886203 | 2.32 | 4.796 | 89.837 | 90.016 |
| 92.49721085905541 | 2.279 | 4.731 | 89.592 | 89.765 |
| 92.66455931573077 | 2.242 | 4.659 | 89.279 | 89.447 |
| 92.83190777240611 | 2.2 | 4.603 | 89.021 | 89.185 |
| 92.99925622908145 | 2.143 | 4.565 | 88.851 | 89.011 |
| 93.1666046857568 | 2.079 | 4.528 | 88.763 | 88.918 |
| 93.33395314243214 | 2.012 | 4.487 | 88.677 | 88.829 |
| 93.50130159910749 | 1.975 | 4.497 | 88.417 | 88.568 |
| 93.66865005578283 | 1.948 | 4.503 | 88.047 | 88.196 |
| 93.83599851245818 | 1.892 | 4.435 | 87.796 | 87.943 |
| 94.00334696913353 | 1.849 | 4.376 | 87.563 | 87.706 |
| 94.17069542580886 | 1.809 | 4.312 | 87.365 | 87.504 |
| 94.3380438824842 | 1.78 | 4.287 | 87.091 | 87.23 |
| 94.50539233915954 | 1.731 | 4.259 | 86.923 | 87.061 |
| 94.66344365935292 | 1.687 | 4.241 | 86.761 | 86.899 |
| 94.83079211602828 | 1.657 | 4.257 | 86.617 | 86.756 |
| 94.99814057270362 | 1.634 | 4.268 | 86.497 | 86.636 |
| 95.16548902937897 | 1.635 | 4.262 | 86.451 | 86.591 |
| 95.33283748605432 | 1.635 | 4.257 | 86.407 | 86.547 |
| 95.50018594272963 | 1.626 | 4.279 | 86.535 | 86.676 |
| 95.66753439940499 | 1.626 | 4.309 | 86.662 | 86.806 |
| 95.83488285608034 | 1.66 | 4.348 | 86.711 | 86.856 |
| 96.00223131275567 | 1.684 | 4.386 | 86.873 | 87.018 |
| 96.16957976943102 | 1.702 | 4.426 | 87.086 | 87.232 |
| 96.33692822610638 | 1.74 | 4.421 | 87.221 | 87.367 |
| 96.50427668278171 | 1.778 | 4.418 | 87.356 | 87.502 |
| 96.67162513945706 | 1.771 | 4.425 | 87.515 | 87.662 |
| 96.8389735961324 | 1.76 | 4.42 | 87.617 | 87.763 |
| 96.99702491632577 | 1.768 | 4.418 | 87.568 | 87.714 |
| 97.16437337300111 | 1.787 | 4.432 | 87.429 | 87.577 |
| 97.33172182967647 | 1.799 | 4.456 | 87.288 | 87.437 |
| 97.49907028635181 | 1.8 | 4.486 | 87.189 | 87.34 |
| 97.66641874302715 | 1.801 | 4.527 | 87.176 | 87.329 |
| 97.8337671997025 | 1.799 | 4.571 | 87.177 | 87.333 |
| 98.00111565637785 | 1.787 | 4.627 | 87.229 | 87.386 |
| 98.16846411305319 | 1.774 | 4.67 | 87.27 | 87.43 |
| 98.33581256972855 | 1.761 | 4.654 | 87.27 | 87.43 |
| 98.50316102640389 | 1.754 | 4.659 | 87.213 | 87.374 |
| 98.67050948307921 | 1.76 | 4.663 | 87.099 | 87.26 |
| 98.83785793975456 | 1.77 | 4.662 | 87.034 | 87.196 |
| 99.0052063964299 | 1.765 | 4.659 | 87.035 | 87.197 |
| 99.17255485310525 | 1.742 | 4.7 | 87.019 | 87.184 |
| 99.33060617329863 | 1.743 | 4.685 | 87.045 | 87.21 |
| 99.49795462997399 | 1.737 | 4.68 | 87.145 | 87.31 |
| 99.66530308664933 | 1.71 | 4.715 | 87.36 | 87.527 |
| 99.83265154332467 | 1.728 | 4.727 | 87.369 | 87.536 |
| 100.0 | 1.738 | 4.762 | 87.445 | 87.614 |